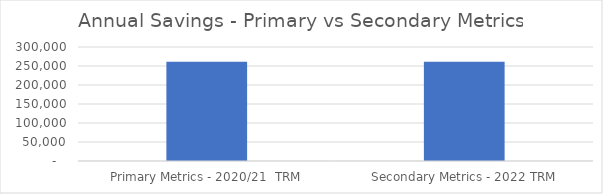
| Category | Series 0 |
|---|---|
| Primary Metrics - 2020/21  TRM | 261276.626 |
| Secondary Metrics - 2022 TRM | 260952.677 |